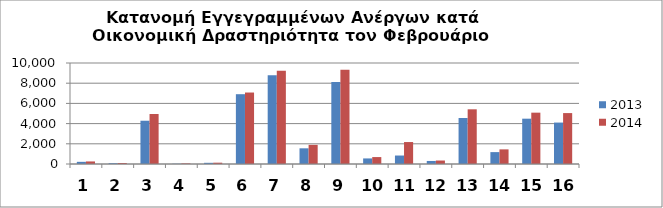
| Category | 2013 | 2014 |
|---|---|---|
| 0 | 214 | 253 |
| 1 | 81 | 100 |
| 2 | 4284 | 4948 |
| 3 | 24 | 56 |
| 4 | 118 | 130 |
| 5 | 6911 | 7077 |
| 6 | 8792 | 9229 |
| 7 | 1553 | 1895 |
| 8 | 8120 | 9324 |
| 9 | 552 | 686 |
| 10 | 839 | 2174 |
| 11 | 301 | 345 |
| 12 | 4554 | 5415 |
| 13 | 1177 | 1448 |
| 14 | 4487 | 5083 |
| 15 | 4102 | 5041 |